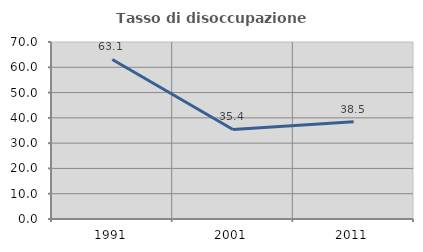
| Category | Tasso di disoccupazione giovanile  |
|---|---|
| 1991.0 | 63.107 |
| 2001.0 | 35.417 |
| 2011.0 | 38.462 |